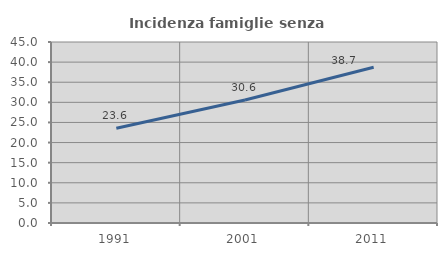
| Category | Incidenza famiglie senza nuclei |
|---|---|
| 1991.0 | 23.565 |
| 2001.0 | 30.588 |
| 2011.0 | 38.728 |